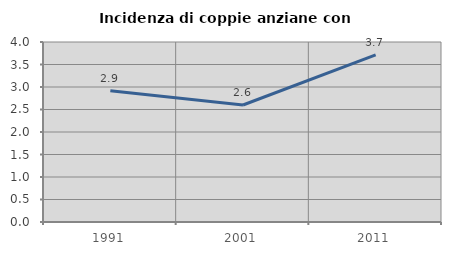
| Category | Incidenza di coppie anziane con figli |
|---|---|
| 1991.0 | 2.915 |
| 2001.0 | 2.6 |
| 2011.0 | 3.713 |